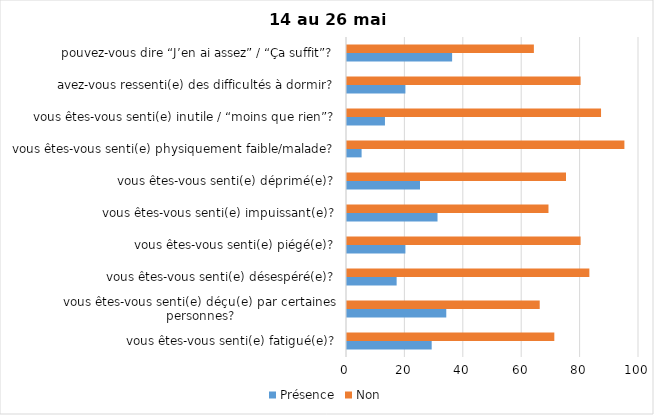
| Category | Présence | Non |
|---|---|---|
| vous êtes-vous senti(e) fatigué(e)? | 29 | 71 |
| vous êtes-vous senti(e) déçu(e) par certaines personnes? | 34 | 66 |
| vous êtes-vous senti(e) désespéré(e)? | 17 | 83 |
| vous êtes-vous senti(e) piégé(e)? | 20 | 80 |
| vous êtes-vous senti(e) impuissant(e)? | 31 | 69 |
| vous êtes-vous senti(e) déprimé(e)? | 25 | 75 |
| vous êtes-vous senti(e) physiquement faible/malade? | 5 | 95 |
| vous êtes-vous senti(e) inutile / “moins que rien”? | 13 | 87 |
| avez-vous ressenti(e) des difficultés à dormir? | 20 | 80 |
| pouvez-vous dire “J’en ai assez” / “Ça suffit”? | 36 | 64 |